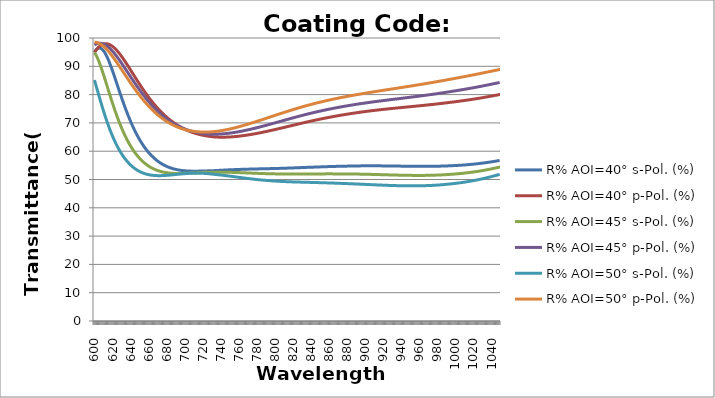
| Category | R% AOI=40° s-Pol. (%) | R% AOI=40° p-Pol. (%) | R% AOI=45° s-Pol. (%) | R% AOI=45° p-Pol. (%) | R% AOI=50° s-Pol. (%) | R% AOI=50° p-Pol. (%) |
|---|---|---|---|---|---|---|
| 600.0 | 94.927 | 94.885 | 94.9 | 97.57 | 85.129 | 98.545 |
| 601.0 | 95.459 | 95.363 | 94.4 | 97.755 | 84.029 | 98.522 |
| 602.0 | 95.882 | 95.801 | 93.819 | 97.906 | 82.919 | 98.469 |
| 603.0 | 96.194 | 96.2 | 93.162 | 98.021 | 81.805 | 98.387 |
| 604.0 | 96.399 | 96.559 | 92.438 | 98.101 | 80.693 | 98.277 |
| 605.0 | 96.497 | 96.877 | 91.654 | 98.147 | 79.586 | 98.139 |
| 606.0 | 96.492 | 97.155 | 90.818 | 98.16 | 78.489 | 97.976 |
| 607.0 | 96.387 | 97.392 | 89.936 | 98.14 | 77.404 | 97.786 |
| 608.0 | 96.187 | 97.589 | 89.016 | 98.087 | 76.336 | 97.573 |
| 609.0 | 95.897 | 97.746 | 88.065 | 98.004 | 75.286 | 97.336 |
| 610.0 | 95.521 | 97.863 | 87.088 | 97.891 | 74.256 | 97.076 |
| 611.0 | 95.067 | 97.941 | 86.091 | 97.748 | 73.249 | 96.796 |
| 612.0 | 94.539 | 97.982 | 85.08 | 97.578 | 72.266 | 96.495 |
| 613.0 | 93.944 | 97.984 | 84.059 | 97.381 | 71.307 | 96.176 |
| 614.0 | 93.288 | 97.95 | 83.034 | 97.158 | 70.375 | 95.838 |
| 615.0 | 92.577 | 97.882 | 82.008 | 96.911 | 69.469 | 95.484 |
| 616.0 | 91.818 | 97.778 | 80.984 | 96.641 | 68.59 | 95.114 |
| 617.0 | 91.016 | 97.642 | 79.968 | 96.349 | 67.739 | 94.73 |
| 618.0 | 90.178 | 97.474 | 78.96 | 96.036 | 66.915 | 94.332 |
| 619.0 | 89.308 | 97.276 | 77.965 | 95.704 | 66.119 | 93.923 |
| 620.0 | 88.413 | 97.049 | 76.984 | 95.354 | 65.351 | 93.502 |
| 621.0 | 87.496 | 96.795 | 76.019 | 94.987 | 64.61 | 93.07 |
| 622.0 | 86.564 | 96.515 | 75.072 | 94.605 | 63.896 | 92.63 |
| 623.0 | 85.62 | 96.21 | 74.144 | 94.208 | 63.209 | 92.182 |
| 624.0 | 84.668 | 95.883 | 73.236 | 93.798 | 62.549 | 91.726 |
| 625.0 | 83.713 | 95.534 | 72.35 | 93.376 | 61.914 | 91.264 |
| 626.0 | 82.757 | 95.165 | 71.486 | 92.944 | 61.305 | 90.797 |
| 627.0 | 81.803 | 94.777 | 70.644 | 92.502 | 60.721 | 90.325 |
| 628.0 | 80.855 | 94.373 | 69.826 | 92.051 | 60.161 | 89.85 |
| 629.0 | 79.914 | 93.953 | 69.032 | 91.593 | 59.625 | 89.372 |
| 630.0 | 78.984 | 93.519 | 68.261 | 91.128 | 59.113 | 88.892 |
| 631.0 | 78.065 | 93.073 | 67.514 | 90.658 | 58.623 | 88.41 |
| 632.0 | 77.16 | 92.614 | 66.79 | 90.182 | 58.155 | 87.928 |
| 633.0 | 76.268 | 92.145 | 66.089 | 89.703 | 57.708 | 87.444 |
| 634.0 | 75.395 | 91.669 | 65.413 | 89.222 | 57.282 | 86.962 |
| 635.0 | 74.542 | 91.186 | 64.762 | 88.74 | 56.878 | 86.483 |
| 636.0 | 73.707 | 90.697 | 64.134 | 88.256 | 56.493 | 86.005 |
| 637.0 | 72.891 | 90.202 | 63.528 | 87.772 | 56.127 | 85.53 |
| 638.0 | 72.094 | 89.703 | 62.944 | 87.288 | 55.779 | 85.057 |
| 639.0 | 71.317 | 89.2 | 62.381 | 86.805 | 55.449 | 84.587 |
| 640.0 | 70.56 | 88.695 | 61.84 | 86.323 | 55.136 | 84.12 |
| 641.0 | 69.824 | 88.188 | 61.32 | 85.842 | 54.84 | 83.658 |
| 642.0 | 69.108 | 87.68 | 60.82 | 85.364 | 54.559 | 83.199 |
| 643.0 | 68.412 | 87.173 | 60.339 | 84.889 | 54.294 | 82.746 |
| 644.0 | 67.737 | 86.666 | 59.878 | 84.417 | 54.045 | 82.297 |
| 645.0 | 67.083 | 86.16 | 59.436 | 83.949 | 53.81 | 81.853 |
| 646.0 | 66.449 | 85.657 | 59.012 | 83.485 | 53.588 | 81.415 |
| 647.0 | 65.835 | 85.156 | 58.606 | 83.025 | 53.381 | 80.982 |
| 648.0 | 65.241 | 84.658 | 58.218 | 82.57 | 53.186 | 80.555 |
| 649.0 | 64.667 | 84.164 | 57.846 | 82.12 | 53.004 | 80.134 |
| 650.0 | 64.112 | 83.674 | 57.491 | 81.675 | 52.834 | 79.72 |
| 651.0 | 63.577 | 83.189 | 57.152 | 81.236 | 52.676 | 79.312 |
| 652.0 | 63.06 | 82.708 | 56.829 | 80.803 | 52.529 | 78.91 |
| 653.0 | 62.561 | 82.234 | 56.52 | 80.376 | 52.393 | 78.516 |
| 654.0 | 62.081 | 81.764 | 56.227 | 79.955 | 52.267 | 78.128 |
| 655.0 | 61.618 | 81.3 | 55.947 | 79.54 | 52.152 | 77.746 |
| 656.0 | 61.172 | 80.843 | 55.681 | 79.132 | 52.046 | 77.372 |
| 657.0 | 60.744 | 80.392 | 55.428 | 78.731 | 51.949 | 77.005 |
| 658.0 | 60.332 | 79.948 | 55.188 | 78.336 | 51.861 | 76.645 |
| 659.0 | 59.935 | 79.511 | 54.961 | 77.948 | 51.781 | 76.292 |
| 660.0 | 59.555 | 79.08 | 54.745 | 77.567 | 51.709 | 75.947 |
| 661.0 | 59.19 | 78.657 | 54.541 | 77.193 | 51.646 | 75.608 |
| 662.0 | 58.839 | 78.241 | 54.349 | 76.826 | 51.589 | 75.277 |
| 663.0 | 58.503 | 77.832 | 54.167 | 76.466 | 51.54 | 74.953 |
| 664.0 | 58.181 | 77.431 | 53.995 | 76.113 | 51.497 | 74.636 |
| 665.0 | 57.873 | 77.037 | 53.834 | 75.767 | 51.46 | 74.326 |
| 666.0 | 57.578 | 76.651 | 53.682 | 75.429 | 51.43 | 74.024 |
| 667.0 | 57.296 | 76.272 | 53.54 | 75.097 | 51.405 | 73.729 |
| 668.0 | 57.026 | 75.901 | 53.407 | 74.773 | 51.386 | 73.441 |
| 669.0 | 56.768 | 75.537 | 53.283 | 74.456 | 51.371 | 73.16 |
| 670.0 | 56.523 | 75.181 | 53.166 | 74.146 | 51.362 | 72.886 |
| 671.0 | 56.288 | 74.833 | 53.058 | 73.842 | 51.357 | 72.619 |
| 672.0 | 56.065 | 74.492 | 52.958 | 73.546 | 51.356 | 72.359 |
| 673.0 | 55.853 | 74.159 | 52.865 | 73.257 | 51.359 | 72.106 |
| 674.0 | 55.651 | 73.834 | 52.779 | 72.975 | 51.366 | 71.86 |
| 675.0 | 55.458 | 73.516 | 52.7 | 72.7 | 51.376 | 71.621 |
| 676.0 | 55.276 | 73.205 | 52.627 | 72.431 | 51.389 | 71.389 |
| 677.0 | 55.103 | 72.902 | 52.561 | 72.17 | 51.405 | 71.163 |
| 678.0 | 54.939 | 72.606 | 52.5 | 71.915 | 51.423 | 70.944 |
| 679.0 | 54.784 | 72.317 | 52.446 | 71.666 | 51.444 | 70.732 |
| 680.0 | 54.638 | 72.035 | 52.396 | 71.424 | 51.467 | 70.526 |
| 681.0 | 54.499 | 71.761 | 52.352 | 71.189 | 51.492 | 70.326 |
| 682.0 | 54.369 | 71.493 | 52.313 | 70.96 | 51.519 | 70.133 |
| 683.0 | 54.246 | 71.233 | 52.279 | 70.738 | 51.547 | 69.946 |
| 684.0 | 54.13 | 70.979 | 52.248 | 70.522 | 51.576 | 69.766 |
| 685.0 | 54.022 | 70.732 | 52.223 | 70.312 | 51.606 | 69.591 |
| 686.0 | 53.92 | 70.492 | 52.201 | 70.108 | 51.637 | 69.423 |
| 687.0 | 53.825 | 70.258 | 52.182 | 69.911 | 51.669 | 69.261 |
| 688.0 | 53.736 | 70.031 | 52.168 | 69.719 | 51.701 | 69.104 |
| 689.0 | 53.654 | 69.811 | 52.156 | 69.533 | 51.733 | 68.954 |
| 690.0 | 53.577 | 69.596 | 52.148 | 69.353 | 51.766 | 68.809 |
| 691.0 | 53.505 | 69.388 | 52.142 | 69.179 | 51.798 | 68.67 |
| 692.0 | 53.44 | 69.186 | 52.14 | 69.011 | 51.83 | 68.537 |
| 693.0 | 53.379 | 68.99 | 52.139 | 68.848 | 51.862 | 68.409 |
| 694.0 | 53.323 | 68.8 | 52.141 | 68.69 | 51.893 | 68.286 |
| 695.0 | 53.272 | 68.616 | 52.146 | 68.539 | 51.923 | 68.169 |
| 696.0 | 53.225 | 68.438 | 52.152 | 68.392 | 51.952 | 68.058 |
| 697.0 | 53.183 | 68.265 | 52.16 | 68.251 | 51.981 | 67.951 |
| 698.0 | 53.145 | 68.098 | 52.169 | 68.115 | 52.009 | 67.85 |
| 699.0 | 53.11 | 67.936 | 52.18 | 67.984 | 52.035 | 67.754 |
| 700.0 | 53.08 | 67.78 | 52.192 | 67.858 | 52.06 | 67.662 |
| 701.0 | 53.053 | 67.629 | 52.206 | 67.737 | 52.084 | 67.576 |
| 702.0 | 53.029 | 67.483 | 52.221 | 67.621 | 52.106 | 67.495 |
| 703.0 | 53.009 | 67.342 | 52.236 | 67.51 | 52.127 | 67.418 |
| 704.0 | 52.991 | 67.207 | 52.252 | 67.403 | 52.146 | 67.346 |
| 705.0 | 52.977 | 67.076 | 52.269 | 67.302 | 52.164 | 67.279 |
| 706.0 | 52.965 | 66.95 | 52.286 | 67.204 | 52.18 | 67.216 |
| 707.0 | 52.956 | 66.829 | 52.304 | 67.112 | 52.194 | 67.158 |
| 708.0 | 52.949 | 66.713 | 52.322 | 67.023 | 52.206 | 67.104 |
| 709.0 | 52.944 | 66.601 | 52.34 | 66.939 | 52.216 | 67.054 |
| 710.0 | 52.941 | 66.494 | 52.358 | 66.86 | 52.224 | 67.009 |
| 711.0 | 52.941 | 66.391 | 52.376 | 66.784 | 52.231 | 66.968 |
| 712.0 | 52.942 | 66.292 | 52.394 | 66.713 | 52.235 | 66.931 |
| 713.0 | 52.945 | 66.198 | 52.412 | 66.646 | 52.238 | 66.898 |
| 714.0 | 52.95 | 66.108 | 52.429 | 66.583 | 52.238 | 66.869 |
| 715.0 | 52.956 | 66.022 | 52.446 | 66.524 | 52.236 | 66.844 |
| 716.0 | 52.963 | 65.94 | 52.463 | 66.468 | 52.233 | 66.822 |
| 717.0 | 52.971 | 65.862 | 52.479 | 66.417 | 52.228 | 66.805 |
| 718.0 | 52.981 | 65.788 | 52.495 | 66.369 | 52.22 | 66.791 |
| 719.0 | 52.992 | 65.718 | 52.51 | 66.325 | 52.211 | 66.781 |
| 720.0 | 53 | 65.649 | 52.52 | 66.282 | 52.195 | 66.772 |
| 721.0 | 53.008 | 65.583 | 52.529 | 66.241 | 52.177 | 66.765 |
| 722.0 | 53.017 | 65.52 | 52.537 | 66.204 | 52.157 | 66.762 |
| 723.0 | 53.026 | 65.461 | 52.544 | 66.171 | 52.135 | 66.761 |
| 724.0 | 53.036 | 65.405 | 52.55 | 66.14 | 52.111 | 66.764 |
| 725.0 | 53.046 | 65.353 | 52.556 | 66.113 | 52.086 | 66.771 |
| 726.0 | 53.056 | 65.304 | 52.56 | 66.089 | 52.058 | 66.78 |
| 727.0 | 53.067 | 65.257 | 52.564 | 66.068 | 52.029 | 66.792 |
| 728.0 | 53.078 | 65.214 | 52.566 | 66.05 | 51.999 | 66.808 |
| 729.0 | 53.089 | 65.175 | 52.568 | 66.035 | 51.966 | 66.826 |
| 730.0 | 53.1 | 65.138 | 52.568 | 66.023 | 51.932 | 66.847 |
| 731.0 | 53.112 | 65.104 | 52.568 | 66.014 | 51.897 | 66.871 |
| 732.0 | 53.123 | 65.073 | 52.566 | 66.008 | 51.86 | 66.898 |
| 733.0 | 53.134 | 65.044 | 52.564 | 66.004 | 51.822 | 66.928 |
| 734.0 | 53.148 | 65.02 | 52.563 | 66.005 | 51.786 | 66.961 |
| 735.0 | 53.166 | 65.003 | 52.567 | 66.012 | 51.755 | 66.999 |
| 736.0 | 53.185 | 64.988 | 52.571 | 66.021 | 51.724 | 67.04 |
| 737.0 | 53.204 | 64.975 | 52.573 | 66.032 | 51.691 | 67.084 |
| 738.0 | 53.222 | 64.966 | 52.575 | 66.046 | 51.657 | 67.13 |
| 739.0 | 53.24 | 64.958 | 52.576 | 66.063 | 51.622 | 67.178 |
| 740.0 | 53.258 | 64.954 | 52.576 | 66.082 | 51.586 | 67.228 |
| 741.0 | 53.276 | 64.951 | 52.576 | 66.104 | 51.55 | 67.281 |
| 742.0 | 53.294 | 64.951 | 52.574 | 66.127 | 51.513 | 67.336 |
| 743.0 | 53.311 | 64.953 | 52.572 | 66.153 | 51.475 | 67.392 |
| 744.0 | 53.328 | 64.958 | 52.569 | 66.181 | 51.436 | 67.451 |
| 745.0 | 53.345 | 64.965 | 52.566 | 66.211 | 51.397 | 67.512 |
| 746.0 | 53.362 | 64.974 | 52.561 | 66.244 | 51.357 | 67.576 |
| 747.0 | 53.378 | 64.985 | 52.556 | 66.278 | 51.316 | 67.64 |
| 748.0 | 53.394 | 64.998 | 52.55 | 66.315 | 51.276 | 67.707 |
| 749.0 | 53.41 | 65.013 | 52.544 | 66.353 | 51.234 | 67.776 |
| 750.0 | 53.425 | 65.031 | 52.537 | 66.394 | 51.193 | 67.846 |
| 751.0 | 53.44 | 65.05 | 52.529 | 66.436 | 51.151 | 67.918 |
| 752.0 | 53.454 | 65.071 | 52.521 | 66.48 | 51.109 | 67.992 |
| 753.0 | 53.468 | 65.094 | 52.512 | 66.526 | 51.066 | 68.067 |
| 754.0 | 53.482 | 65.119 | 52.503 | 66.574 | 51.024 | 68.144 |
| 755.0 | 53.495 | 65.146 | 52.493 | 66.623 | 50.981 | 68.222 |
| 756.0 | 53.508 | 65.174 | 52.483 | 66.674 | 50.939 | 68.302 |
| 757.0 | 53.521 | 65.204 | 52.473 | 66.727 | 50.896 | 68.384 |
| 758.0 | 53.533 | 65.236 | 52.462 | 66.781 | 50.853 | 68.466 |
| 759.0 | 53.545 | 65.269 | 52.45 | 66.837 | 50.811 | 68.551 |
| 760.0 | 53.557 | 65.305 | 52.439 | 66.894 | 50.768 | 68.636 |
| 761.0 | 53.568 | 65.341 | 52.427 | 66.953 | 50.726 | 68.723 |
| 762.0 | 53.579 | 65.379 | 52.415 | 67.013 | 50.684 | 68.81 |
| 763.0 | 53.59 | 65.419 | 52.402 | 67.075 | 50.642 | 68.899 |
| 764.0 | 53.6 | 65.46 | 52.389 | 67.138 | 50.6 | 68.99 |
| 765.0 | 53.61 | 65.503 | 52.377 | 67.202 | 50.559 | 69.081 |
| 766.0 | 53.62 | 65.547 | 52.364 | 67.268 | 50.518 | 69.173 |
| 767.0 | 53.63 | 65.592 | 52.35 | 67.335 | 50.477 | 69.266 |
| 768.0 | 53.639 | 65.639 | 52.337 | 67.403 | 50.437 | 69.36 |
| 769.0 | 53.648 | 65.687 | 52.324 | 67.472 | 50.397 | 69.455 |
| 770.0 | 53.657 | 65.736 | 52.31 | 67.542 | 50.357 | 69.551 |
| 771.0 | 53.665 | 65.787 | 52.297 | 67.614 | 50.318 | 69.648 |
| 772.0 | 53.674 | 65.838 | 52.284 | 67.686 | 50.28 | 69.746 |
| 773.0 | 53.682 | 65.891 | 52.27 | 67.759 | 50.242 | 69.844 |
| 774.0 | 53.69 | 65.945 | 52.257 | 67.834 | 50.204 | 69.943 |
| 775.0 | 53.698 | 66 | 52.244 | 67.909 | 50.168 | 70.042 |
| 776.0 | 53.706 | 66.056 | 52.231 | 67.986 | 50.131 | 70.143 |
| 777.0 | 53.714 | 66.114 | 52.218 | 68.063 | 50.095 | 70.244 |
| 778.0 | 53.721 | 66.172 | 52.205 | 68.141 | 50.06 | 70.345 |
| 779.0 | 53.729 | 66.231 | 52.192 | 68.22 | 50.026 | 70.447 |
| 780.0 | 53.736 | 66.291 | 52.18 | 68.299 | 49.992 | 70.55 |
| 781.0 | 53.743 | 66.352 | 52.167 | 68.38 | 49.958 | 70.652 |
| 782.0 | 53.75 | 66.414 | 52.155 | 68.461 | 49.926 | 70.756 |
| 783.0 | 53.758 | 66.477 | 52.143 | 68.542 | 49.894 | 70.859 |
| 784.0 | 53.765 | 66.54 | 52.131 | 68.625 | 49.862 | 70.964 |
| 785.0 | 53.772 | 66.605 | 52.12 | 68.708 | 49.832 | 71.068 |
| 786.0 | 53.779 | 66.67 | 52.109 | 68.791 | 49.802 | 71.172 |
| 787.0 | 53.787 | 66.736 | 52.098 | 68.876 | 49.772 | 71.277 |
| 788.0 | 53.794 | 66.802 | 52.087 | 68.96 | 49.744 | 71.382 |
| 789.0 | 53.801 | 66.87 | 52.077 | 69.045 | 49.716 | 71.488 |
| 790.0 | 53.809 | 66.938 | 52.067 | 69.131 | 49.688 | 71.593 |
| 791.0 | 53.816 | 67.006 | 52.058 | 69.217 | 49.662 | 71.698 |
| 792.0 | 53.824 | 67.076 | 52.048 | 69.303 | 49.636 | 71.804 |
| 793.0 | 53.831 | 67.146 | 52.039 | 69.39 | 49.61 | 71.91 |
| 794.0 | 53.839 | 67.216 | 52.031 | 69.477 | 49.586 | 72.016 |
| 795.0 | 53.847 | 67.287 | 52.023 | 69.565 | 49.562 | 72.121 |
| 796.0 | 53.854 | 67.358 | 52.015 | 69.652 | 49.539 | 72.227 |
| 797.0 | 53.862 | 67.43 | 52.007 | 69.74 | 49.516 | 72.332 |
| 798.0 | 53.871 | 67.502 | 52 | 69.828 | 49.494 | 72.438 |
| 799.0 | 53.879 | 67.575 | 51.993 | 69.917 | 49.473 | 72.543 |
| 800.0 | 53.887 | 67.648 | 51.987 | 70.006 | 49.452 | 72.649 |
| 801.0 | 53.896 | 67.722 | 51.981 | 70.094 | 49.432 | 72.754 |
| 802.0 | 53.904 | 67.796 | 51.975 | 70.183 | 49.412 | 72.859 |
| 803.0 | 53.913 | 67.87 | 51.97 | 70.272 | 49.393 | 72.964 |
| 804.0 | 53.922 | 67.944 | 51.965 | 70.361 | 49.375 | 73.068 |
| 805.0 | 53.932 | 68.019 | 51.96 | 70.45 | 49.357 | 73.172 |
| 806.0 | 53.941 | 68.094 | 51.956 | 70.539 | 49.34 | 73.276 |
| 807.0 | 53.95 | 68.17 | 51.952 | 70.628 | 49.323 | 73.38 |
| 808.0 | 53.96 | 68.245 | 51.949 | 70.717 | 49.307 | 73.483 |
| 809.0 | 53.97 | 68.321 | 51.945 | 70.806 | 49.291 | 73.586 |
| 810.0 | 53.98 | 68.397 | 51.943 | 70.895 | 49.276 | 73.689 |
| 811.0 | 53.99 | 68.473 | 51.94 | 70.984 | 49.261 | 73.791 |
| 812.0 | 54.001 | 68.549 | 51.938 | 71.073 | 49.247 | 73.893 |
| 813.0 | 54.011 | 68.625 | 51.936 | 71.161 | 49.233 | 73.995 |
| 814.0 | 54.022 | 68.701 | 51.935 | 71.25 | 49.22 | 74.096 |
| 815.0 | 54.033 | 68.778 | 51.934 | 71.338 | 49.207 | 74.196 |
| 816.0 | 54.044 | 68.854 | 51.933 | 71.426 | 49.195 | 74.297 |
| 817.0 | 54.055 | 68.931 | 51.932 | 71.514 | 49.183 | 74.396 |
| 818.0 | 54.067 | 69.007 | 51.932 | 71.602 | 49.171 | 74.496 |
| 819.0 | 54.078 | 69.084 | 51.932 | 71.689 | 49.16 | 74.594 |
| 820.0 | 54.09 | 69.16 | 51.932 | 71.776 | 49.149 | 74.692 |
| 821.0 | 54.102 | 69.236 | 51.933 | 71.863 | 49.139 | 74.79 |
| 822.0 | 54.114 | 69.313 | 51.934 | 71.949 | 49.128 | 74.887 |
| 823.0 | 54.126 | 69.389 | 51.935 | 72.036 | 49.119 | 74.984 |
| 824.0 | 54.139 | 69.465 | 51.936 | 72.121 | 49.109 | 75.08 |
| 825.0 | 54.151 | 69.541 | 51.938 | 72.207 | 49.1 | 75.175 |
| 826.0 | 54.164 | 69.617 | 51.939 | 72.292 | 49.09 | 75.27 |
| 827.0 | 54.177 | 69.693 | 51.941 | 72.377 | 49.082 | 75.364 |
| 828.0 | 54.19 | 69.768 | 51.943 | 72.461 | 49.073 | 75.458 |
| 829.0 | 54.202 | 69.843 | 51.946 | 72.545 | 49.064 | 75.551 |
| 830.0 | 54.216 | 69.918 | 51.948 | 72.629 | 49.056 | 75.643 |
| 831.0 | 54.229 | 69.993 | 51.95 | 72.712 | 49.048 | 75.735 |
| 832.0 | 54.242 | 70.068 | 51.953 | 72.795 | 49.04 | 75.826 |
| 833.0 | 54.256 | 70.142 | 51.956 | 72.877 | 49.032 | 75.917 |
| 834.0 | 54.269 | 70.216 | 51.959 | 72.958 | 49.025 | 76.006 |
| 835.0 | 54.281 | 70.288 | 51.96 | 73.038 | 49.016 | 76.094 |
| 836.0 | 54.292 | 70.36 | 51.962 | 73.117 | 49.006 | 76.181 |
| 837.0 | 54.304 | 70.431 | 51.963 | 73.195 | 48.997 | 76.267 |
| 838.0 | 54.315 | 70.502 | 51.964 | 73.273 | 48.988 | 76.352 |
| 839.0 | 54.327 | 70.573 | 51.966 | 73.35 | 48.979 | 76.437 |
| 840.0 | 54.338 | 70.643 | 51.967 | 73.427 | 48.97 | 76.521 |
| 841.0 | 54.35 | 70.713 | 51.968 | 73.504 | 48.961 | 76.604 |
| 842.0 | 54.362 | 70.782 | 51.97 | 73.579 | 48.952 | 76.687 |
| 843.0 | 54.373 | 70.851 | 51.972 | 73.654 | 48.944 | 76.769 |
| 844.0 | 54.385 | 70.92 | 51.973 | 73.729 | 48.935 | 76.851 |
| 845.0 | 54.397 | 70.988 | 51.975 | 73.803 | 48.926 | 76.932 |
| 846.0 | 54.408 | 71.056 | 51.976 | 73.877 | 48.917 | 77.012 |
| 847.0 | 54.42 | 71.124 | 51.978 | 73.95 | 48.908 | 77.091 |
| 848.0 | 54.432 | 71.191 | 51.979 | 74.022 | 48.899 | 77.17 |
| 849.0 | 54.443 | 71.258 | 51.98 | 74.094 | 48.89 | 77.248 |
| 850.0 | 54.454 | 71.324 | 51.982 | 74.166 | 48.881 | 77.326 |
| 851.0 | 54.466 | 71.39 | 51.983 | 74.236 | 48.871 | 77.402 |
| 852.0 | 54.477 | 71.455 | 51.984 | 74.306 | 48.862 | 77.478 |
| 853.0 | 54.488 | 71.52 | 51.985 | 74.376 | 48.853 | 77.554 |
| 854.0 | 54.499 | 71.584 | 51.986 | 74.445 | 48.843 | 77.629 |
| 855.0 | 54.51 | 71.648 | 51.987 | 74.513 | 48.833 | 77.703 |
| 856.0 | 54.521 | 71.712 | 51.988 | 74.581 | 48.824 | 77.776 |
| 857.0 | 54.532 | 71.775 | 51.988 | 74.648 | 48.814 | 77.85 |
| 858.0 | 54.542 | 71.837 | 51.988 | 74.715 | 48.804 | 77.922 |
| 859.0 | 54.553 | 71.899 | 51.989 | 74.781 | 48.793 | 77.993 |
| 860.0 | 54.563 | 71.96 | 51.989 | 74.846 | 48.783 | 78.064 |
| 861.0 | 54.573 | 72.021 | 51.989 | 74.911 | 48.772 | 78.135 |
| 862.0 | 54.583 | 72.082 | 51.988 | 74.975 | 48.762 | 78.205 |
| 863.0 | 54.593 | 72.142 | 51.988 | 75.039 | 48.751 | 78.274 |
| 864.0 | 54.602 | 72.201 | 51.987 | 75.102 | 48.74 | 78.342 |
| 865.0 | 54.612 | 72.26 | 51.987 | 75.164 | 48.729 | 78.41 |
| 866.0 | 54.621 | 72.318 | 51.986 | 75.226 | 48.717 | 78.478 |
| 867.0 | 54.63 | 72.376 | 51.984 | 75.288 | 48.706 | 78.545 |
| 868.0 | 54.639 | 72.433 | 51.983 | 75.348 | 48.694 | 78.611 |
| 869.0 | 54.647 | 72.49 | 51.981 | 75.408 | 48.682 | 78.677 |
| 870.0 | 54.656 | 72.546 | 51.979 | 75.468 | 48.67 | 78.742 |
| 871.0 | 54.664 | 72.602 | 51.977 | 75.527 | 48.658 | 78.806 |
| 872.0 | 54.671 | 72.657 | 51.975 | 75.585 | 48.645 | 78.871 |
| 873.0 | 54.679 | 72.711 | 51.972 | 75.643 | 48.633 | 78.934 |
| 874.0 | 54.686 | 72.765 | 51.969 | 75.7 | 48.62 | 78.997 |
| 875.0 | 54.693 | 72.819 | 51.966 | 75.757 | 48.607 | 79.06 |
| 876.0 | 54.7 | 72.872 | 51.963 | 75.813 | 48.594 | 79.122 |
| 877.0 | 54.706 | 72.924 | 51.959 | 75.869 | 48.58 | 79.183 |
| 878.0 | 54.713 | 72.976 | 51.956 | 75.924 | 48.567 | 79.244 |
| 879.0 | 54.719 | 73.028 | 51.952 | 75.979 | 48.553 | 79.305 |
| 880.0 | 54.728 | 73.08 | 51.95 | 76.034 | 48.542 | 79.365 |
| 881.0 | 54.736 | 73.131 | 51.948 | 76.088 | 48.53 | 79.426 |
| 882.0 | 54.743 | 73.182 | 51.946 | 76.142 | 48.518 | 79.485 |
| 883.0 | 54.751 | 73.233 | 51.943 | 76.196 | 48.506 | 79.545 |
| 884.0 | 54.758 | 73.283 | 51.94 | 76.249 | 48.494 | 79.604 |
| 885.0 | 54.764 | 73.332 | 51.937 | 76.301 | 48.481 | 79.662 |
| 886.0 | 54.771 | 73.382 | 51.934 | 76.353 | 48.469 | 79.72 |
| 887.0 | 54.777 | 73.43 | 51.93 | 76.405 | 48.456 | 79.778 |
| 888.0 | 54.783 | 73.478 | 51.926 | 76.456 | 48.443 | 79.835 |
| 889.0 | 54.788 | 73.525 | 51.922 | 76.506 | 48.43 | 79.892 |
| 890.0 | 54.793 | 73.572 | 51.918 | 76.556 | 48.417 | 79.948 |
| 891.0 | 54.798 | 73.618 | 51.913 | 76.606 | 48.403 | 80.004 |
| 892.0 | 54.803 | 73.664 | 51.908 | 76.655 | 48.39 | 80.06 |
| 893.0 | 54.807 | 73.71 | 51.903 | 76.704 | 48.376 | 80.115 |
| 894.0 | 54.811 | 73.755 | 51.897 | 76.752 | 48.362 | 80.17 |
| 895.0 | 54.814 | 73.799 | 51.891 | 76.8 | 48.348 | 80.225 |
| 896.0 | 54.817 | 73.843 | 51.885 | 76.847 | 48.334 | 80.279 |
| 897.0 | 54.82 | 73.886 | 51.879 | 76.894 | 48.32 | 80.333 |
| 898.0 | 54.823 | 73.929 | 51.873 | 76.941 | 48.306 | 80.387 |
| 899.0 | 54.825 | 73.972 | 51.866 | 76.987 | 48.292 | 80.44 |
| 900.0 | 54.827 | 74.014 | 51.859 | 77.033 | 48.278 | 80.493 |
| 901.0 | 54.829 | 74.055 | 51.852 | 77.078 | 48.263 | 80.546 |
| 902.0 | 54.83 | 74.096 | 51.845 | 77.124 | 48.249 | 80.599 |
| 903.0 | 54.831 | 74.137 | 51.838 | 77.168 | 48.234 | 80.651 |
| 904.0 | 54.832 | 74.178 | 51.83 | 77.213 | 48.22 | 80.703 |
| 905.0 | 54.832 | 74.217 | 51.822 | 77.257 | 48.206 | 80.755 |
| 906.0 | 54.832 | 74.257 | 51.814 | 77.301 | 48.191 | 80.806 |
| 907.0 | 54.832 | 74.296 | 51.806 | 77.344 | 48.177 | 80.858 |
| 908.0 | 54.832 | 74.334 | 51.798 | 77.388 | 48.162 | 80.909 |
| 909.0 | 54.831 | 74.373 | 51.789 | 77.43 | 48.148 | 80.96 |
| 910.0 | 54.83 | 74.411 | 51.781 | 77.473 | 48.134 | 81.011 |
| 911.0 | 54.829 | 74.448 | 51.772 | 77.515 | 48.12 | 81.062 |
| 912.0 | 54.827 | 74.485 | 51.763 | 77.557 | 48.106 | 81.112 |
| 913.0 | 54.826 | 74.522 | 51.754 | 77.599 | 48.091 | 81.163 |
| 914.0 | 54.824 | 74.559 | 51.745 | 77.641 | 48.078 | 81.213 |
| 915.0 | 54.822 | 74.595 | 51.736 | 77.682 | 48.064 | 81.263 |
| 916.0 | 54.819 | 74.631 | 51.727 | 77.724 | 48.05 | 81.313 |
| 917.0 | 54.817 | 74.666 | 51.718 | 77.764 | 48.036 | 81.363 |
| 918.0 | 54.814 | 74.702 | 51.709 | 77.805 | 48.023 | 81.412 |
| 919.0 | 54.811 | 74.736 | 51.7 | 77.846 | 48.01 | 81.462 |
| 920.0 | 54.808 | 74.771 | 51.69 | 77.886 | 47.997 | 81.512 |
| 921.0 | 54.804 | 74.806 | 51.681 | 77.926 | 47.984 | 81.561 |
| 922.0 | 54.801 | 74.84 | 51.672 | 77.967 | 47.971 | 81.611 |
| 923.0 | 54.797 | 74.874 | 51.663 | 78.007 | 47.959 | 81.66 |
| 924.0 | 54.794 | 74.907 | 51.653 | 78.046 | 47.947 | 81.709 |
| 925.0 | 54.79 | 74.941 | 51.644 | 78.086 | 47.935 | 81.758 |
| 926.0 | 54.786 | 74.974 | 51.635 | 78.126 | 47.923 | 81.808 |
| 927.0 | 54.782 | 75.007 | 51.626 | 78.165 | 47.912 | 81.857 |
| 928.0 | 54.777 | 75.04 | 51.617 | 78.205 | 47.9 | 81.906 |
| 929.0 | 54.773 | 75.072 | 51.608 | 78.244 | 47.89 | 81.955 |
| 930.0 | 54.768 | 75.104 | 51.599 | 78.283 | 47.879 | 82.004 |
| 931.0 | 54.764 | 75.137 | 51.59 | 78.322 | 47.869 | 82.054 |
| 932.0 | 54.759 | 75.169 | 51.582 | 78.362 | 47.859 | 82.103 |
| 933.0 | 54.755 | 75.201 | 51.574 | 78.4 | 47.85 | 82.152 |
| 934.0 | 54.75 | 75.232 | 51.565 | 78.44 | 47.84 | 82.201 |
| 935.0 | 54.745 | 75.264 | 51.557 | 78.479 | 47.832 | 82.25 |
| 936.0 | 54.74 | 75.296 | 51.549 | 78.518 | 47.823 | 82.3 |
| 937.0 | 54.736 | 75.327 | 51.541 | 78.557 | 47.815 | 82.349 |
| 938.0 | 54.731 | 75.358 | 51.534 | 78.596 | 47.808 | 82.398 |
| 939.0 | 54.726 | 75.39 | 51.526 | 78.635 | 47.801 | 82.448 |
| 940.0 | 54.722 | 75.421 | 51.519 | 78.674 | 47.794 | 82.498 |
| 941.0 | 54.717 | 75.452 | 51.512 | 78.713 | 47.788 | 82.547 |
| 942.0 | 54.712 | 75.483 | 51.506 | 78.752 | 47.782 | 82.597 |
| 943.0 | 54.708 | 75.514 | 51.499 | 78.791 | 47.777 | 82.647 |
| 944.0 | 54.703 | 75.545 | 51.493 | 78.83 | 47.772 | 82.697 |
| 945.0 | 54.699 | 75.576 | 51.488 | 78.87 | 47.768 | 82.747 |
| 946.0 | 54.695 | 75.607 | 51.482 | 78.909 | 47.764 | 82.797 |
| 947.0 | 54.691 | 75.638 | 51.477 | 78.949 | 47.761 | 82.847 |
| 948.0 | 54.687 | 75.668 | 51.472 | 78.988 | 47.758 | 82.897 |
| 949.0 | 54.683 | 75.699 | 51.468 | 79.028 | 47.756 | 82.948 |
| 950.0 | 54.679 | 75.73 | 51.463 | 79.068 | 47.755 | 82.998 |
| 951.0 | 54.675 | 75.761 | 51.46 | 79.108 | 47.754 | 83.049 |
| 952.0 | 54.672 | 75.792 | 51.456 | 79.148 | 47.754 | 83.1 |
| 953.0 | 54.669 | 75.823 | 51.453 | 79.188 | 47.754 | 83.151 |
| 954.0 | 54.666 | 75.854 | 51.451 | 79.228 | 47.755 | 83.202 |
| 955.0 | 54.663 | 75.886 | 51.448 | 79.269 | 47.756 | 83.253 |
| 956.0 | 54.66 | 75.917 | 51.447 | 79.309 | 47.759 | 83.305 |
| 957.0 | 54.658 | 75.948 | 51.445 | 79.35 | 47.762 | 83.356 |
| 958.0 | 54.656 | 75.98 | 51.445 | 79.391 | 47.765 | 83.408 |
| 959.0 | 54.654 | 76.012 | 51.444 | 79.432 | 47.769 | 83.46 |
| 960.0 | 54.653 | 76.043 | 51.444 | 79.474 | 47.774 | 83.512 |
| 961.0 | 54.651 | 76.075 | 51.445 | 79.515 | 47.78 | 83.565 |
| 962.0 | 54.65 | 76.107 | 51.446 | 79.557 | 47.786 | 83.617 |
| 963.0 | 54.65 | 76.139 | 51.448 | 79.599 | 47.793 | 83.67 |
| 964.0 | 54.649 | 76.171 | 51.45 | 79.641 | 47.801 | 83.723 |
| 965.0 | 54.649 | 76.204 | 51.452 | 79.684 | 47.809 | 83.776 |
| 966.0 | 54.65 | 76.236 | 51.456 | 79.726 | 47.818 | 83.829 |
| 967.0 | 54.65 | 76.269 | 51.46 | 79.769 | 47.828 | 83.883 |
| 968.0 | 54.652 | 76.302 | 51.464 | 79.812 | 47.839 | 83.936 |
| 969.0 | 54.653 | 76.336 | 51.469 | 79.855 | 47.851 | 83.99 |
| 970.0 | 54.655 | 76.369 | 51.474 | 79.899 | 47.863 | 84.044 |
| 971.0 | 54.657 | 76.402 | 51.481 | 79.943 | 47.876 | 84.098 |
| 972.0 | 54.66 | 76.436 | 51.487 | 79.987 | 47.89 | 84.153 |
| 973.0 | 54.663 | 76.47 | 51.495 | 80.031 | 47.905 | 84.208 |
| 974.0 | 54.666 | 76.505 | 51.503 | 80.076 | 47.92 | 84.263 |
| 975.0 | 54.67 | 76.539 | 51.512 | 80.121 | 47.937 | 84.318 |
| 976.0 | 54.675 | 76.574 | 51.521 | 80.166 | 47.954 | 84.373 |
| 977.0 | 54.68 | 76.609 | 51.531 | 80.212 | 47.972 | 84.429 |
| 978.0 | 54.685 | 76.644 | 51.542 | 80.257 | 47.991 | 84.484 |
| 979.0 | 54.691 | 76.68 | 51.553 | 80.304 | 48.011 | 84.54 |
| 980.0 | 54.698 | 76.716 | 51.565 | 80.35 | 48.032 | 84.597 |
| 981.0 | 54.704 | 76.752 | 51.578 | 80.397 | 48.054 | 84.653 |
| 982.0 | 54.712 | 76.788 | 51.591 | 80.444 | 48.076 | 84.71 |
| 983.0 | 54.72 | 76.825 | 51.606 | 80.491 | 48.1 | 84.767 |
| 984.0 | 54.728 | 76.862 | 51.621 | 80.539 | 48.124 | 84.824 |
| 985.0 | 54.738 | 76.9 | 51.636 | 80.587 | 48.149 | 84.881 |
| 986.0 | 54.747 | 76.938 | 51.653 | 80.635 | 48.176 | 84.939 |
| 987.0 | 54.758 | 76.976 | 51.67 | 80.684 | 48.203 | 84.997 |
| 988.0 | 54.768 | 77.014 | 51.688 | 80.732 | 48.231 | 85.055 |
| 989.0 | 54.78 | 77.053 | 51.707 | 80.782 | 48.26 | 85.113 |
| 990.0 | 54.792 | 77.092 | 51.727 | 80.831 | 48.29 | 85.172 |
| 991.0 | 54.805 | 77.131 | 51.747 | 80.881 | 48.321 | 85.23 |
| 992.0 | 54.818 | 77.171 | 51.768 | 80.932 | 48.353 | 85.29 |
| 993.0 | 54.832 | 77.211 | 51.791 | 80.982 | 48.386 | 85.349 |
| 994.0 | 54.847 | 77.252 | 51.814 | 81.033 | 48.42 | 85.408 |
| 995.0 | 54.861 | 77.291 | 51.836 | 81.084 | 48.454 | 85.467 |
| 996.0 | 54.875 | 77.33 | 51.858 | 81.133 | 48.488 | 85.525 |
| 997.0 | 54.889 | 77.37 | 51.881 | 81.183 | 48.522 | 85.583 |
| 998.0 | 54.904 | 77.41 | 51.905 | 81.234 | 48.558 | 85.641 |
| 999.0 | 54.92 | 77.45 | 51.93 | 81.284 | 48.594 | 85.7 |
| 1000.0 | 54.936 | 77.491 | 51.956 | 81.335 | 48.632 | 85.758 |
| 1001.0 | 54.953 | 77.532 | 51.982 | 81.387 | 48.671 | 85.818 |
| 1002.0 | 54.971 | 77.574 | 52.01 | 81.439 | 48.71 | 85.877 |
| 1003.0 | 54.99 | 77.615 | 52.038 | 81.491 | 48.751 | 85.936 |
| 1004.0 | 55.009 | 77.658 | 52.067 | 81.543 | 48.793 | 85.996 |
| 1005.0 | 55.029 | 77.7 | 52.097 | 81.596 | 48.836 | 86.056 |
| 1006.0 | 55.05 | 77.744 | 52.128 | 81.65 | 48.879 | 86.116 |
| 1007.0 | 55.071 | 77.787 | 52.16 | 81.703 | 48.924 | 86.176 |
| 1008.0 | 55.094 | 77.831 | 52.193 | 81.757 | 48.97 | 86.237 |
| 1009.0 | 55.117 | 77.876 | 52.227 | 81.812 | 49.017 | 86.298 |
| 1010.0 | 55.141 | 77.92 | 52.261 | 81.866 | 49.065 | 86.359 |
| 1011.0 | 55.165 | 77.966 | 52.297 | 81.922 | 49.114 | 86.42 |
| 1012.0 | 55.191 | 78.012 | 52.334 | 81.977 | 49.165 | 86.482 |
| 1013.0 | 55.217 | 78.058 | 52.371 | 82.033 | 49.216 | 86.543 |
| 1014.0 | 55.244 | 78.104 | 52.409 | 82.089 | 49.268 | 86.605 |
| 1015.0 | 55.272 | 78.152 | 52.449 | 82.146 | 49.322 | 86.667 |
| 1016.0 | 55.3 | 78.199 | 52.489 | 82.203 | 49.376 | 86.73 |
| 1017.0 | 55.33 | 78.247 | 52.53 | 82.26 | 49.432 | 86.792 |
| 1018.0 | 55.36 | 78.295 | 52.572 | 82.318 | 49.489 | 86.855 |
| 1019.0 | 55.391 | 78.344 | 52.616 | 82.376 | 49.547 | 86.917 |
| 1020.0 | 55.423 | 78.394 | 52.66 | 82.435 | 49.606 | 86.98 |
| 1021.0 | 55.455 | 78.444 | 52.705 | 82.494 | 49.666 | 87.044 |
| 1022.0 | 55.489 | 78.494 | 52.751 | 82.553 | 49.727 | 87.107 |
| 1023.0 | 55.524 | 78.544 | 52.798 | 82.612 | 49.79 | 87.171 |
| 1024.0 | 55.559 | 78.596 | 52.847 | 82.672 | 49.853 | 87.234 |
| 1025.0 | 55.595 | 78.647 | 52.896 | 82.733 | 49.918 | 87.298 |
| 1026.0 | 55.632 | 78.7 | 52.946 | 82.794 | 49.984 | 87.362 |
| 1027.0 | 55.67 | 78.752 | 52.997 | 82.855 | 50.051 | 87.427 |
| 1028.0 | 55.709 | 78.805 | 53.05 | 82.916 | 50.119 | 87.491 |
| 1029.0 | 55.748 | 78.859 | 53.103 | 82.978 | 50.188 | 87.556 |
| 1030.0 | 55.789 | 78.913 | 53.157 | 83.04 | 50.259 | 87.621 |
| 1031.0 | 55.831 | 78.967 | 53.212 | 83.103 | 50.33 | 87.686 |
| 1032.0 | 55.873 | 79.022 | 53.269 | 83.166 | 50.403 | 87.751 |
| 1033.0 | 55.916 | 79.078 | 53.326 | 83.229 | 50.477 | 87.816 |
| 1034.0 | 55.96 | 79.134 | 53.385 | 83.293 | 50.552 | 87.881 |
| 1035.0 | 56.006 | 79.19 | 53.444 | 83.357 | 50.628 | 87.947 |
| 1036.0 | 56.052 | 79.247 | 53.505 | 83.421 | 50.706 | 88.012 |
| 1037.0 | 56.099 | 79.304 | 53.566 | 83.486 | 50.784 | 88.078 |
| 1038.0 | 56.147 | 79.362 | 53.629 | 83.551 | 50.864 | 88.144 |
| 1039.0 | 56.196 | 79.421 | 53.693 | 83.616 | 50.945 | 88.21 |
| 1040.0 | 56.245 | 79.479 | 53.758 | 83.682 | 51.028 | 88.276 |
| 1041.0 | 56.296 | 79.539 | 53.824 | 83.748 | 51.111 | 88.343 |
| 1042.0 | 56.348 | 79.598 | 53.89 | 83.814 | 51.196 | 88.409 |
| 1043.0 | 56.4 | 79.659 | 53.958 | 83.881 | 51.281 | 88.476 |
| 1044.0 | 56.454 | 79.719 | 54.028 | 83.948 | 51.368 | 88.542 |
| 1045.0 | 56.509 | 79.781 | 54.098 | 84.016 | 51.457 | 88.609 |
| 1046.0 | 56.564 | 79.842 | 54.169 | 84.084 | 51.546 | 88.676 |
| 1047.0 | 56.621 | 79.904 | 54.242 | 84.152 | 51.637 | 88.743 |
| 1048.0 | 56.678 | 79.967 | 54.315 | 84.22 | 51.729 | 88.81 |
| 1049.0 | 56.737 | 80.03 | 54.39 | 84.289 | 51.822 | 88.877 |
| 1050.0 | 56.796 | 80.094 | 54.465 | 84.358 | 51.916 | 88.944 |